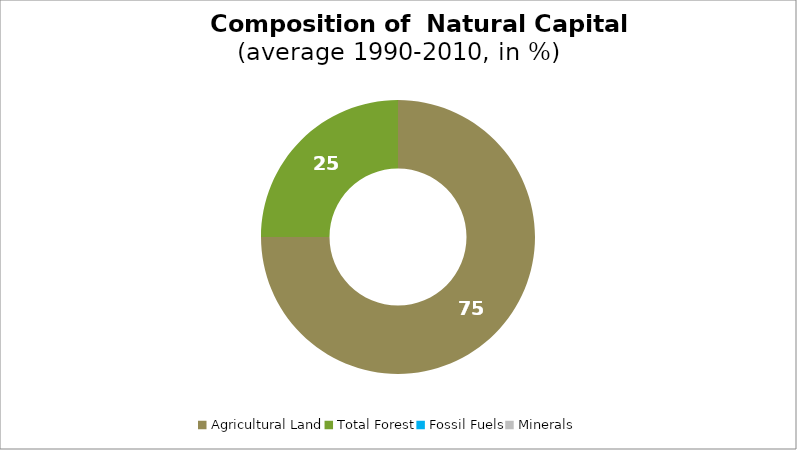
| Category | Series 0 |
|---|---|
| Agricultural Land | 74.989 |
| Total Forest | 25.011 |
| Fossil Fuels | 0 |
| Minerals | 0 |